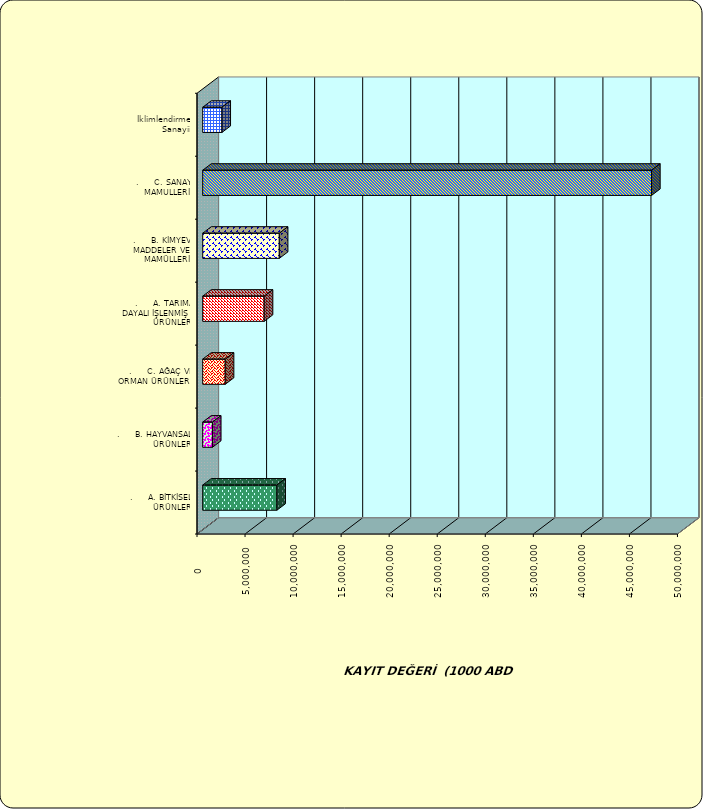
| Category | Series 0 |
|---|---|
| .     A. BİTKİSEL ÜRÜNLER | 7718017.075 |
| .     B. HAYVANSAL ÜRÜNLER | 1013399.59 |
| .     C. AĞAÇ VE ORMAN ÜRÜNLERİ | 2345416.95 |
| .     A. TARIMA DAYALI İŞLENMİŞ ÜRÜNLER | 6402714.563 |
| .     B. KİMYEVİ MADDELER VE MAMÜLLERİ | 7973259.44 |
| .     C. SANAYİ MAMULLERİ | 46712856.636 |
|  İklimlendirme Sanayii | 2001906.461 |